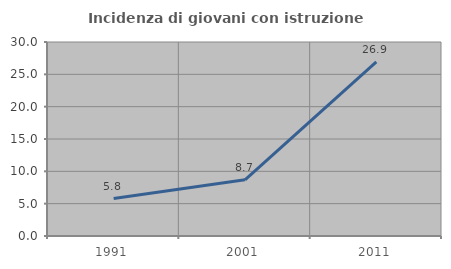
| Category | Incidenza di giovani con istruzione universitaria |
|---|---|
| 1991.0 | 5.797 |
| 2001.0 | 8.696 |
| 2011.0 | 26.923 |